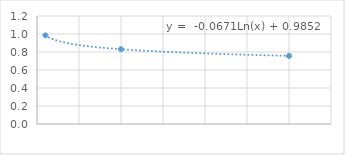
| Category | Series 0 |
|---|---|
| 1.0 | 0.985 |
| 10.0 | 0.831 |
| 30.0 | 0.757 |